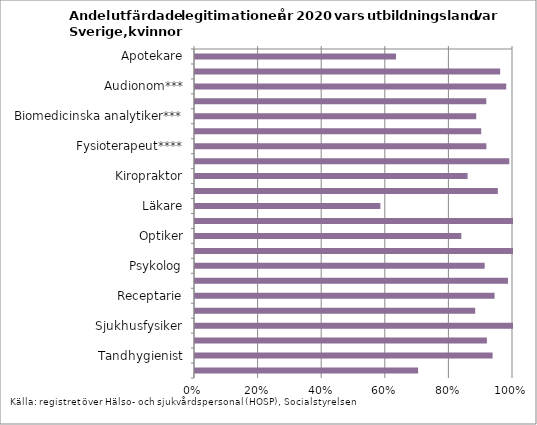
| Category | Series 0 |
|---|---|
| Apotekare | 0.632 |
| Arbetsterapeut | 0.96 |
| Audionom*** | 0.979 |
| Barnmorska | 0.916 |
| Biomedicinska analytiker*** | 0.884 |
| Dietist*** | 0.9 |
| Fysioterapeut**** | 0.916 |
| Hälso- och sjukvårdskurator*** | 0.988 |
| Kiropraktor | 0.857 |
| Logoped | 0.952 |
| Läkare | 0.583 |
| Naprapat | 1 |
| Optiker | 0.838 |
| Ortopedingenjör*** | 1 |
| Psykolog | 0.911 |
| Psykoterapeut | 0.984 |
| Receptarie | 0.942 |
| Röntgensjuksköterska*** | 0.881 |
| Sjukhusfysiker | 1 |
| Sjuksköterska | 0.918 |
| Tandhygienist | 0.936 |
| Tandläkare | 0.702 |